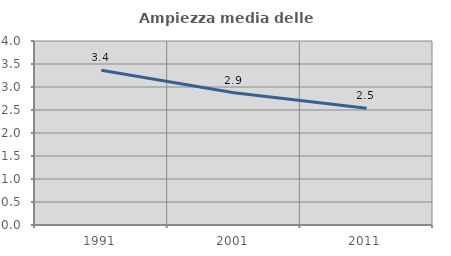
| Category | Ampiezza media delle famiglie |
|---|---|
| 1991.0 | 3.366 |
| 2001.0 | 2.877 |
| 2011.0 | 2.538 |